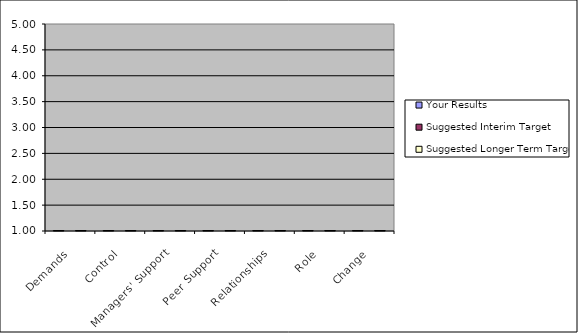
| Category | Your Results | Suggested Interim Target | Suggested Longer Term Target |
|---|---|---|---|
| Demands | 0 |  | 0 |
| Control | 0 |  | 0 |
| Managers' Support | 0 |  | 0 |
| Peer Support | 0 |  | 0 |
| Relationships | 0 |  | 0 |
| Role | 0 |  | 0 |
| Change | 0 |  | 0 |